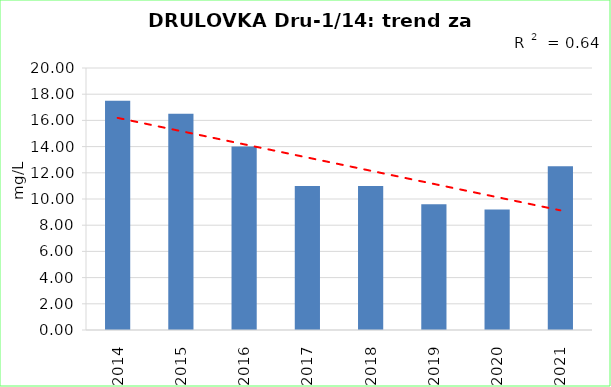
| Category | Vsota |
|---|---|
| 2014 | 17.5 |
| 2015 | 16.5 |
| 2016 | 14 |
| 2017 | 11 |
| 2018 | 11 |
| 2019 | 9.6 |
| 2020 | 9.2 |
| 2021 | 12.5 |